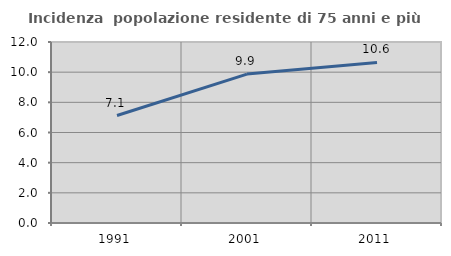
| Category | Incidenza  popolazione residente di 75 anni e più |
|---|---|
| 1991.0 | 7.125 |
| 2001.0 | 9.872 |
| 2011.0 | 10.641 |